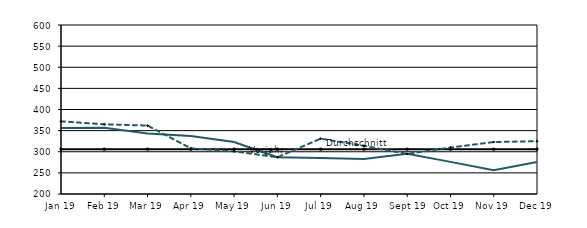
| Category | Berichtsjahr | Durchschnitt | Vorjahr |
|---|---|---|---|
| 2019-01-01 | 356 | 306.167 | 372 |
| 2019-02-01 | 357 | 306.167 | 365 |
| 2019-03-01 | 343 | 306.167 | 362 |
| 2019-04-01 | 337 | 306.167 | 308 |
| 2019-05-01 | 323 | 306.167 | 301 |
| 2019-06-01 | 287 | 306.167 | 287 |
| 2019-07-01 | 285 | 306.167 | 331 |
| 2019-08-01 | 283 | 306.167 | 314 |
| 2019-09-01 | 295 | 306.167 | 295 |
| 2019-10-01 | 276 | 306.167 | 310 |
| 2019-11-01 | 256 | 306.167 | 323 |
| 2019-12-01 | 276 | 306.167 | 325 |